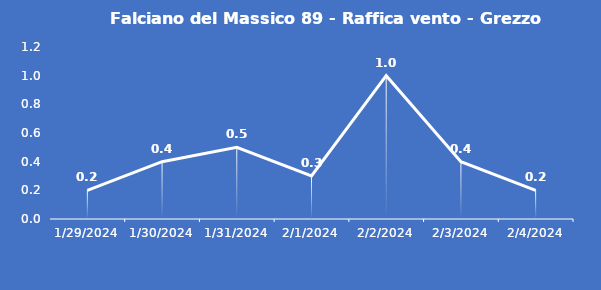
| Category | Falciano del Massico 89 - Raffica vento - Grezzo (m/s) |
|---|---|
| 1/29/24 | 0.2 |
| 1/30/24 | 0.4 |
| 1/31/24 | 0.5 |
| 2/1/24 | 0.3 |
| 2/2/24 | 1 |
| 2/3/24 | 0.4 |
| 2/4/24 | 0.2 |